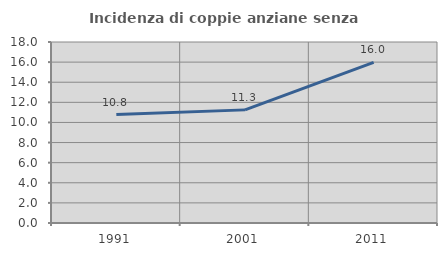
| Category | Incidenza di coppie anziane senza figli  |
|---|---|
| 1991.0 | 10.79 |
| 2001.0 | 11.25 |
| 2011.0 | 15.98 |